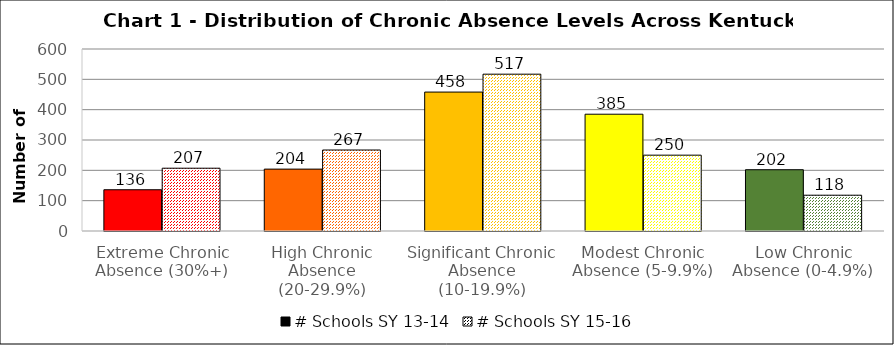
| Category | # Schools SY 13-14 | # Schools SY 15-16 |
|---|---|---|
| Extreme Chronic Absence (30%+) | 136 | 207 |
| High Chronic Absence (20-29.9%) | 204 | 267 |
| Significant Chronic Absence (10-19.9%) | 458 | 517 |
| Modest Chronic Absence (5-9.9%) | 385 | 250 |
| Low Chronic Absence (0-4.9%) | 202 | 118 |